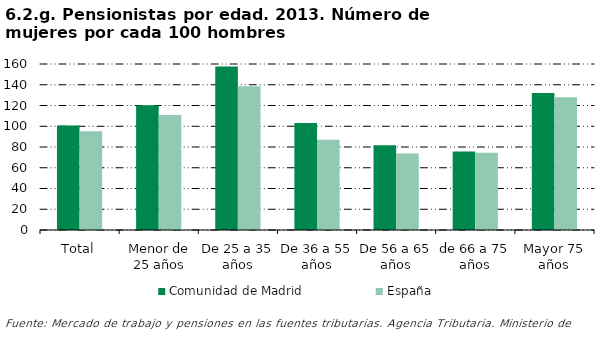
| Category | Comunidad de Madrid | España |
|---|---|---|
| Total | 100.634 | 95.182 |
| Menor de 25 años | 120.212 | 110.808 |
| De 25 a 35 años | 157.667 | 138.6 |
| De 36 a 55 años | 103.182 | 87.017 |
| De 56 a 65 años | 81.728 | 73.635 |
| de 66 a 75 años | 75.753 | 74.55 |
| Mayor 75 años | 131.994 | 127.959 |